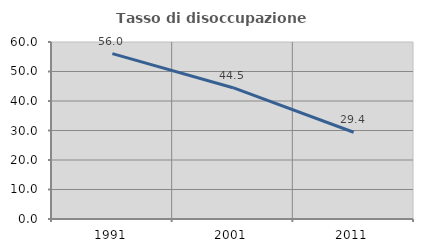
| Category | Tasso di disoccupazione giovanile  |
|---|---|
| 1991.0 | 56.047 |
| 2001.0 | 44.509 |
| 2011.0 | 29.412 |